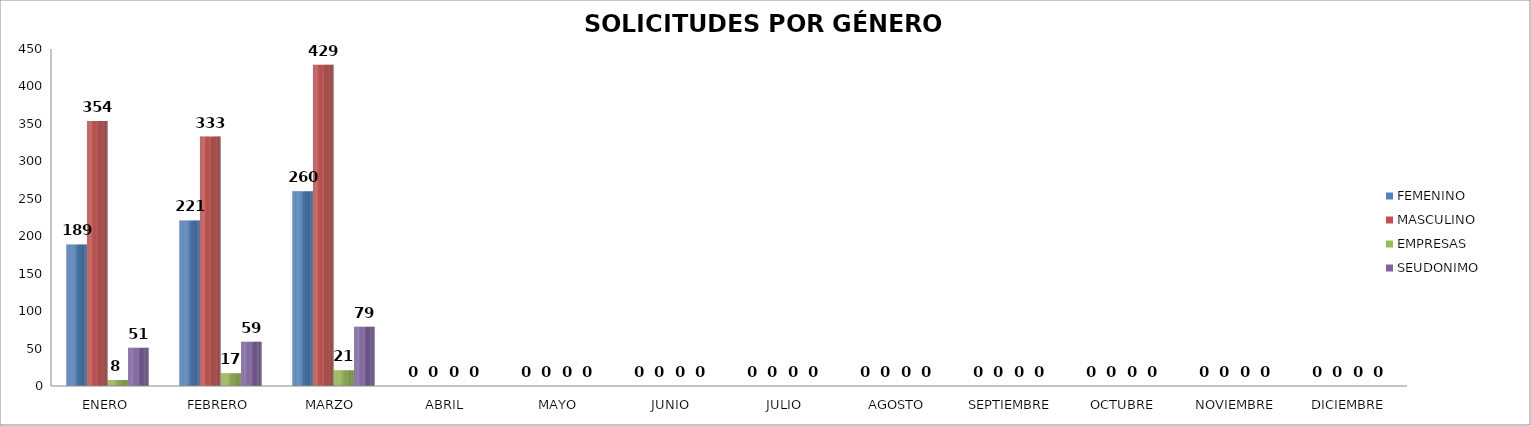
| Category | FEMENINO | MASCULINO | EMPRESAS | SEUDONIMO |
|---|---|---|---|---|
| ENERO | 189 | 354 | 8 | 51 |
| FEBRERO | 221 | 333 | 17 | 59 |
| MARZO  | 260 | 429 | 21 | 79 |
| ABRIL | 0 | 0 | 0 | 0 |
| MAYO | 0 | 0 | 0 | 0 |
| JUNIO | 0 | 0 | 0 | 0 |
| JULIO | 0 | 0 | 0 | 0 |
| AGOSTO | 0 | 0 | 0 | 0 |
| SEPTIEMBRE | 0 | 0 | 0 | 0 |
| OCTUBRE | 0 | 0 | 0 | 0 |
| NOVIEMBRE | 0 | 0 | 0 | 0 |
| DICIEMBRE | 0 | 0 | 0 | 0 |